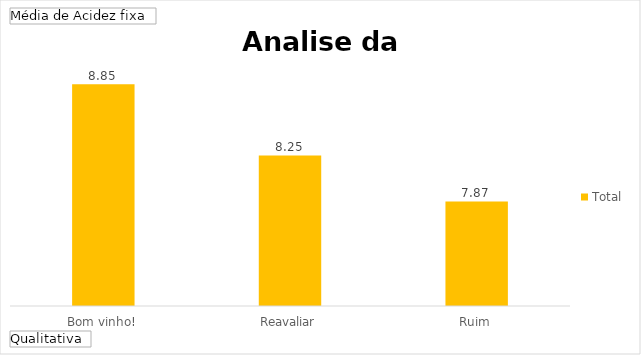
| Category | Total |
|---|---|
| Bom vinho! | 8.847 |
| Reavaliar | 8.254 |
| Ruim | 7.871 |